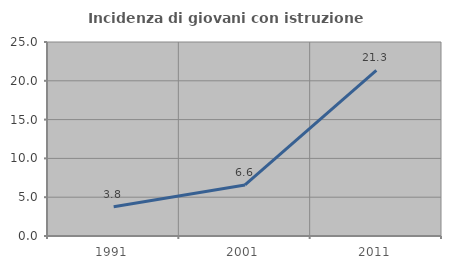
| Category | Incidenza di giovani con istruzione universitaria |
|---|---|
| 1991.0 | 3.774 |
| 2001.0 | 6.579 |
| 2011.0 | 21.348 |